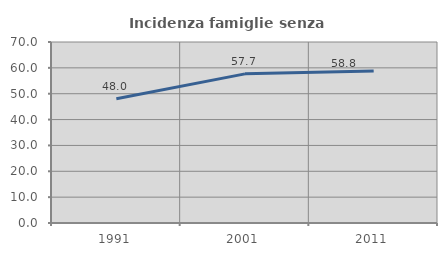
| Category | Incidenza famiglie senza nuclei |
|---|---|
| 1991.0 | 48.031 |
| 2001.0 | 57.678 |
| 2011.0 | 58.824 |